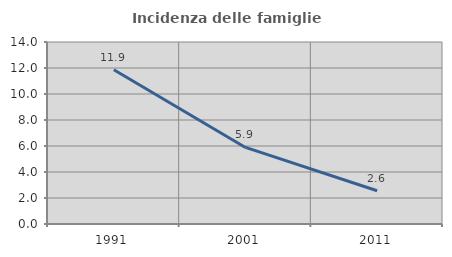
| Category | Incidenza delle famiglie numerose |
|---|---|
| 1991.0 | 11.868 |
| 2001.0 | 5.889 |
| 2011.0 | 2.554 |